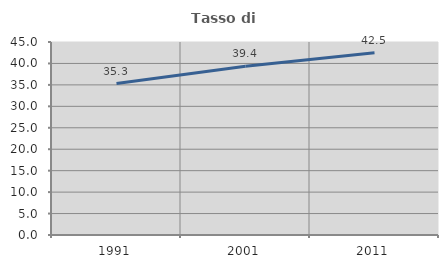
| Category | Tasso di occupazione   |
|---|---|
| 1991.0 | 35.321 |
| 2001.0 | 39.37 |
| 2011.0 | 42.484 |